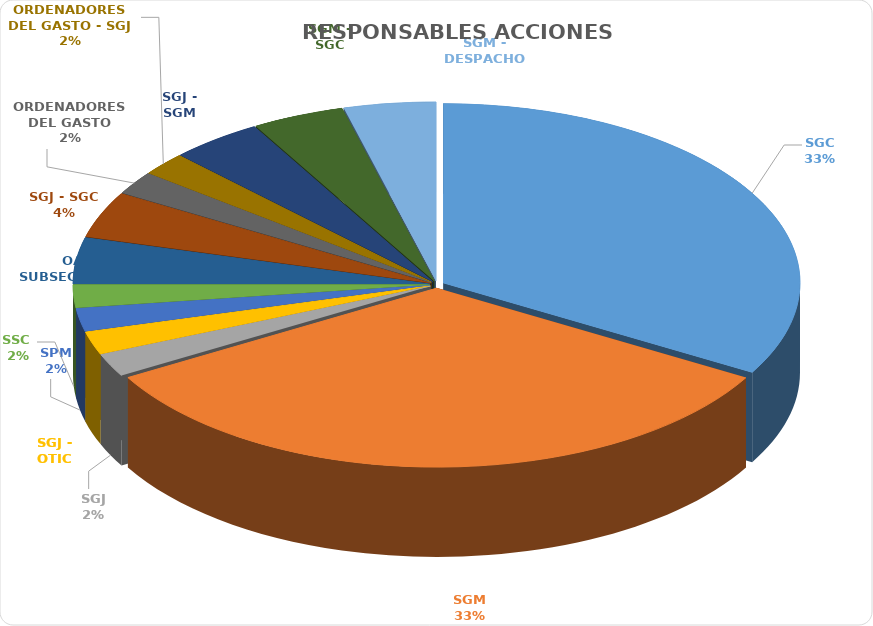
| Category | Series 0 |
|---|---|
| SGC | 16 |
| SGM | 16 |
| SGJ | 1 |
| SGJ - OTIC | 1 |
| SPM | 1 |
| SSC  | 1 |
| OAPI - SUBSECRETARIAS | 2 |
| SGJ - SGC | 2 |
| ORDENADORES DEL GASTO | 1 |
| ORDENADORES DEL GASTO - SGJ | 1 |
| SGJ - SGM | 2 |
| SGM - SGC | 2 |
| SGM - DESPACHO | 2 |